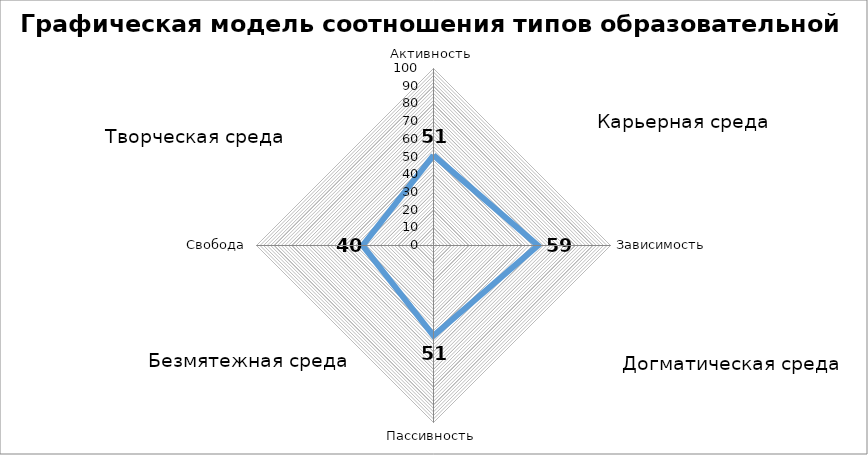
| Category | Графическая модель соотношения типов образовательной среды |
|---|---|
| Активность | 51 |
| Зависимость | 59 |
| Пассивность | 51 |
| Свобода | 40 |